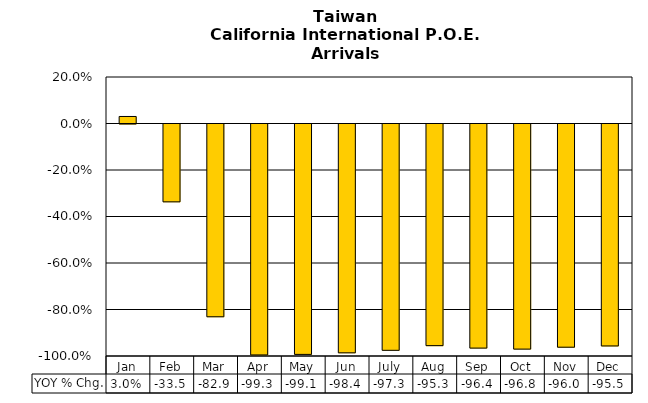
| Category | YOY % Chg. |
|---|---|
| Jan | 0.03 |
| Feb | -0.335 |
| Mar | -0.829 |
| Apr | -0.993 |
| May | -0.991 |
| Jun | -0.984 |
| July | -0.973 |
| Aug | -0.953 |
| Sep | -0.964 |
| Oct | -0.968 |
| Nov | -0.96 |
| Dec | -0.955 |